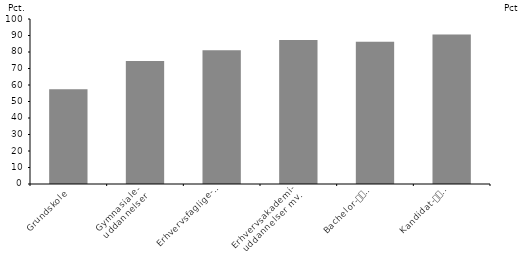
| Category | Beskæftigelsesfrekvens |
|---|---|
| Grundskole | 57.4 |
| Gymnasiale-
uddannelser | 74.5 |
| Erhvervsfaglige-
uddannelser | 81 |
| Erhvervsakademi-
uddannelser mv. | 87.3 |
| Bachelor-
uddannelser* | 86.2 |
| Kandidat-
uddannelser | 90.6 |